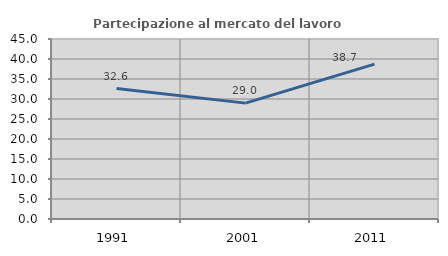
| Category | Partecipazione al mercato del lavoro  femminile |
|---|---|
| 1991.0 | 32.621 |
| 2001.0 | 28.97 |
| 2011.0 | 38.716 |